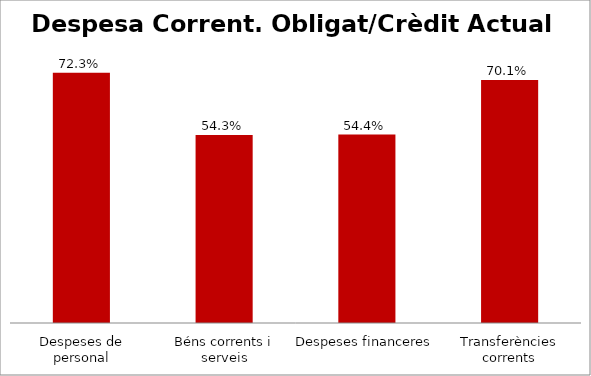
| Category | Series 0 |
|---|---|
| Despeses de personal | 0.723 |
| Béns corrents i serveis | 0.543 |
| Despeses financeres | 0.544 |
| Transferències corrents | 0.701 |